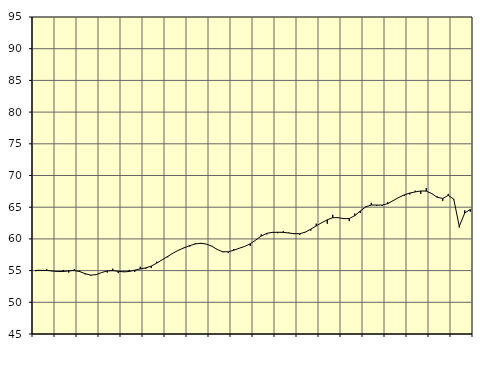
| Category | Piggar | Samtliga sysselsatta (inkl. sysselsatta utomlands) |
|---|---|---|
| nan | 54.9 | 55.04 |
| 1.0 | 55 | 55.04 |
| 1.0 | 55.2 | 55.03 |
| 1.0 | 54.9 | 54.94 |
| nan | 54.8 | 54.85 |
| 2.0 | 55.1 | 54.86 |
| 2.0 | 54.7 | 54.96 |
| 2.0 | 55.2 | 55.01 |
| nan | 55 | 54.84 |
| 3.0 | 54.4 | 54.52 |
| 3.0 | 54.2 | 54.28 |
| 3.0 | 54.4 | 54.37 |
| nan | 54.7 | 54.7 |
| 4.0 | 54.7 | 54.95 |
| 4.0 | 55.3 | 54.99 |
| 4.0 | 54.6 | 54.89 |
| nan | 54.9 | 54.8 |
| 5.0 | 55.1 | 54.86 |
| 5.0 | 54.8 | 55.07 |
| 5.0 | 55.6 | 55.26 |
| nan | 55.3 | 55.43 |
| 6.0 | 55.4 | 55.71 |
| 6.0 | 56.4 | 56.18 |
| 6.0 | 56.7 | 56.72 |
| nan | 57.1 | 57.24 |
| 7.0 | 57.8 | 57.77 |
| 7.0 | 58.2 | 58.23 |
| 7.0 | 58.7 | 58.6 |
| nan | 58.8 | 58.93 |
| 8.0 | 59.3 | 59.21 |
| 8.0 | 59.2 | 59.31 |
| 8.0 | 59.2 | 59.19 |
| nan | 58.9 | 58.85 |
| 9.0 | 58.4 | 58.34 |
| 9.0 | 57.9 | 57.97 |
| 9.0 | 57.8 | 57.96 |
| nan | 58.4 | 58.21 |
| 10.0 | 58.5 | 58.53 |
| 10.0 | 58.8 | 58.82 |
| 10.0 | 58.9 | 59.23 |
| nan | 59.8 | 59.82 |
| 11.0 | 60.7 | 60.45 |
| 11.0 | 60.7 | 60.88 |
| 11.0 | 61.1 | 61.02 |
| nan | 60.9 | 61.05 |
| 12.0 | 61.2 | 61.03 |
| 12.0 | 61 | 60.93 |
| 12.0 | 60.9 | 60.82 |
| nan | 60.6 | 60.82 |
| 13.0 | 61.1 | 61.06 |
| 13.0 | 61.3 | 61.53 |
| 13.0 | 62.4 | 62.05 |
| nan | 62.6 | 62.56 |
| 14.0 | 62.4 | 63.01 |
| 14.0 | 63.8 | 63.34 |
| 14.0 | 63.4 | 63.36 |
| nan | 63.3 | 63.19 |
| 15.0 | 62.8 | 63.21 |
| 15.0 | 64 | 63.67 |
| 15.0 | 64.1 | 64.4 |
| nan | 65 | 65.06 |
| 16.0 | 65.7 | 65.34 |
| 16.0 | 65.2 | 65.34 |
| 16.0 | 65.2 | 65.33 |
| nan | 65.8 | 65.56 |
| 17.0 | 66.1 | 66.05 |
| 17.0 | 66.5 | 66.53 |
| 17.0 | 66.8 | 66.94 |
| nan | 67 | 67.23 |
| 18.0 | 67.6 | 67.41 |
| 18.0 | 67.1 | 67.56 |
| 18.0 | 68 | 67.54 |
| nan | 67.2 | 67.15 |
| 19.0 | 66.7 | 66.56 |
| 19.0 | 66 | 66.38 |
| 19.0 | 67.1 | 66.87 |
| nan | 66.2 | 66.27 |
| 20.0 | 61.8 | 61.99 |
| 20.0 | 64.5 | 64.08 |
| 20.0 | 64.3 | 64.65 |